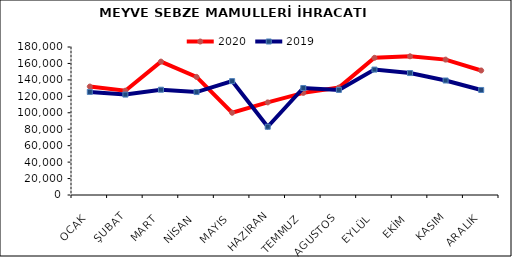
| Category | 2020 | 2019 |
|---|---|---|
| OCAK | 131870.05 | 125353.15 |
| ŞUBAT | 126846.912 | 122127.177 |
| MART | 162233.384 | 128029.563 |
| NİSAN | 143634.926 | 125222.607 |
| MAYIS | 100056.652 | 138481.471 |
| HAZİRAN | 112618.654 | 83008.979 |
| TEMMUZ | 124203.324 | 130147.286 |
| AGUSTOS | 130644.849 | 127810.88 |
| EYLÜL | 166848.214 | 152522.979 |
| EKİM | 168691.978 | 148312.945 |
| KASIM | 164641.321 | 139251.742 |
| ARALIK | 151455.297 | 127743.572 |